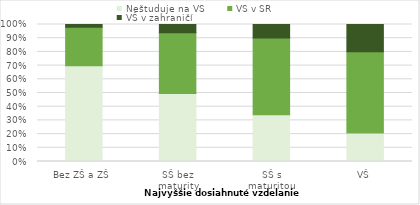
| Category | Neštuduje na VŠ | VŠ v SR | VŠ v zahraničí |
|---|---|---|---|
| Bez ZŠ a ZŠ | 1229 | 493 | 36 |
| SŠ bez
maturity | 9757 | 8700 | 1169 |
| SŠ s
maturitou | 1726 | 2839 | 496 |
| VŠ | 1774 | 5032 | 1685 |